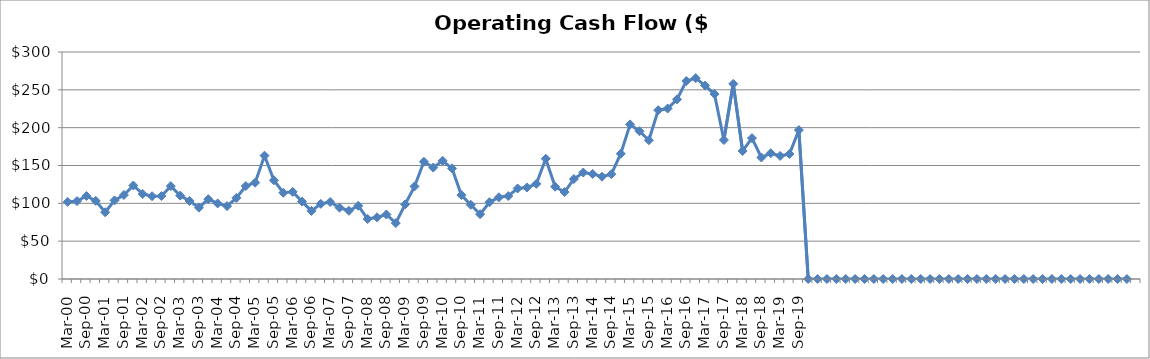
| Category | Operating Cash Flow ($Millions) |
|---|---|
| Mar-00 | 101.878 |
| Jun-00 | 103 |
| Sep-00 | 109.636 |
| Dec-00 | 103.192 |
| Mar-01 | 88.196 |
| Jun-01 | 103.9 |
| Sep-01 | 111.032 |
| Dec-01 | 123.606 |
| Mar-02 | 112.378 |
| Jun-02 | 109.348 |
| Sep-02 | 109.55 |
| Dec-02 | 122.752 |
| Mar-03 | 110.232 |
| Jun-03 | 103.1 |
| Sep-03 | 94.269 |
| Dec-03 | 105.534 |
| Mar-04 | 99.869 |
| Jun-04 | 96.382 |
| Sep-04 | 107.214 |
| Dec-04 | 122.841 |
| Mar-05 | 127.309 |
| Jun-05 | 163.012 |
| Sep-05 | 130.45 |
| Dec-05 | 113.979 |
| Mar-06 | 115.2 |
| Jun-06 | 102.3 |
| Sep-06 | 89.971 |
| Dec-06 | 99.308 |
| Mar-07 | 101.778 |
| Jun-07 | 94.229 |
| Sep-07 | 90.164 |
| Dec-07 | 96.804 |
| Mar-08 | 79.293 |
| Jun-08 | 81.496 |
| Sep-08 | 85.299 |
| Dec-08 | 73.906 |
| Mar-09 | 98.63 |
| Jun-09 | 122.302 |
| Sep-09 | 154.945 |
| Dec-09 | 147.276 |
| Mar-10 | 156.182 |
| Jun-10 | 146.198 |
| Sep-10 | 110.921 |
| Dec-10 | 98.127 |
| Mar-11 | 85.638 |
| Jun-11 | 101.476 |
| Sep-11 | 107.944 |
| Dec-11 | 109.65 |
| Mar-12 | 119.697 |
| Jun-12 | 121 |
| Sep-12 | 125.79 |
| Dec-12 | 158.914 |
| Mar-13 | 121.969 |
| Jun-13 | 114.914 |
| Sep-13 | 132.119 |
| Dec-13 | 140.736 |
| Mar-14 | 138.86 |
| Jun-14 | 135.207 |
| Sep-14 | 138.478 |
| Dec-14 | 165.531 |
| Mar-15 | 204.3 |
| Jun-15 | 195.33 |
| Sep-15 | 183.425 |
| Dec-15 | 223.117 |
| Mar-16 | 225.324 |
| Jun-16 | 237.45 |
| Sep-16 | 261.638 |
| Dec-16 | 265.5 |
| Mar-17 | 255.691 |
| Jun-17 | 244.392 |
| Sep-17 | 183.704 |
| Dec-17 | 257.902 |
| Mar-18 | 169.22 |
| Jun-18 | 186.233 |
| Sep-18 | 160.608 |
| Dec-18 | 166.163 |
| Mar-19 | 162.684 |
| Jun-19 | 165.236 |
| Sep-19 | 196.833 |